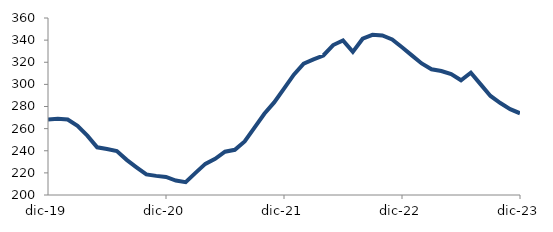
| Category | Series 0 |
|---|---|
| 2019-12-01 | 268.319 |
| 2020-01-01 | 268.914 |
| 2020-02-01 | 268.233 |
| 2020-03-01 | 262.58 |
| 2020-04-01 | 253.663 |
| 2020-05-01 | 243.088 |
| 2020-06-01 | 241.541 |
| 2020-07-01 | 239.786 |
| 2020-08-01 | 231.766 |
| 2020-09-01 | 225.047 |
| 2020-10-01 | 218.571 |
| 2020-11-01 | 217.286 |
| 2020-12-01 | 216.368 |
| 2021-01-01 | 213.087 |
| 2021-02-01 | 211.643 |
| 2021-03-01 | 220.04 |
| 2021-04-01 | 228.12 |
| 2021-05-01 | 232.717 |
| 2021-06-01 | 239.097 |
| 2021-07-01 | 240.846 |
| 2021-08-01 | 248.449 |
| 2021-09-01 | 260.934 |
| 2021-10-01 | 273.441 |
| 2021-11-01 | 283.683 |
| 2021-12-01 | 296.134 |
| 2022-01-01 | 308.804 |
| 2022-02-01 | 318.726 |
| 2022-03-01 | 322.592 |
| 2022-04-01 | 326.114 |
| 2022-05-01 | 335.557 |
| 2022-06-01 | 339.684 |
| 2022-07-01 | 329.357 |
| 2022-08-01 | 341.293 |
| 2022-09-01 | 344.793 |
| 2022-10-01 | 344.185 |
| 2022-11-01 | 340.608 |
| 2022-12-01 | 333.559 |
| 2023-01-01 | 326.199 |
| 2023-02-01 | 318.915 |
| 2023-03-01 | 313.615 |
| 2023-04-01 | 312.076 |
| 2023-05-01 | 309.232 |
| 2023-06-01 | 303.714 |
| 2023-07-01 | 310.493 |
| 2023-08-01 | 299.987 |
| 2023-09-01 | 289.543 |
| 2023-10-01 | 283.093 |
| 2023-11-01 | 277.645 |
| 2023-12-01 | 273.863 |